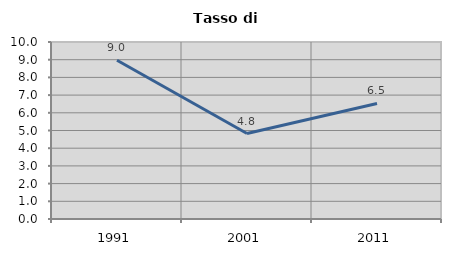
| Category | Tasso di disoccupazione   |
|---|---|
| 1991.0 | 8.966 |
| 2001.0 | 4.829 |
| 2011.0 | 6.527 |